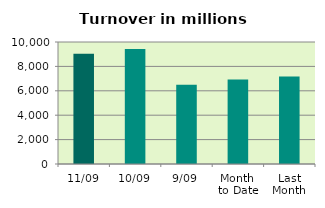
| Category | Series 0 |
|---|---|
| 11/09 | 9043.91 |
| 10/09 | 9429.954 |
| 9/09 | 6499.888 |
| Month 
to Date | 6917.02 |
| Last
Month | 7181.07 |